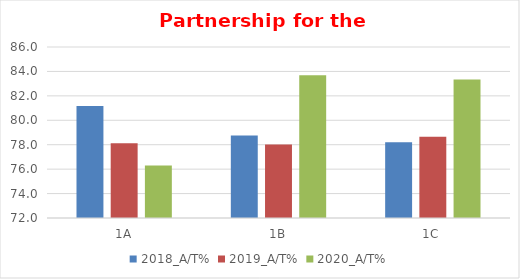
| Category | 2018_A/T% | 2019_A/T% | 2020_A/T% |
|---|---|---|---|
| 1A | 81.176 | 78.125 | 76.289 |
| 1B | 78.75 | 78.022 | 83.696 |
| 1C | 78.205 | 78.652 | 83.333 |